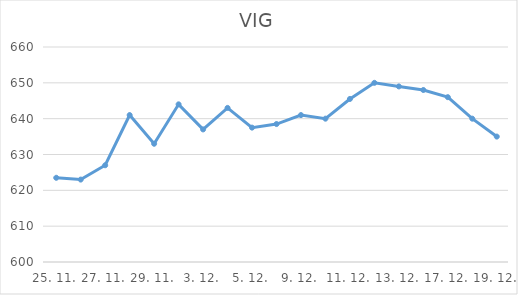
| Category | VIG |
|---|---|
| 25. 11. | 623.5 |
| 26. 11. | 623 |
| 27. 11. | 627 |
| 28. 11. | 641 |
| 29. 11. | 633 |
| 2. 12. | 644 |
| 3. 12. | 637 |
| 4. 12. | 643 |
| 5. 12. | 637.5 |
| 6. 12. | 638.5 |
| 9. 12. | 641 |
| 10. 12. | 640 |
| 11. 12. | 645.5 |
| 12. 12. | 650 |
| 13. 12. | 649 |
| 16. 12. | 648 |
| 17. 12. | 646 |
| 18. 12. | 640 |
| 19. 12. | 635 |